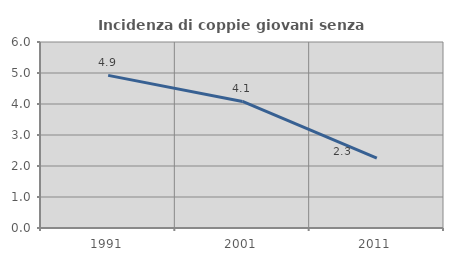
| Category | Incidenza di coppie giovani senza figli |
|---|---|
| 1991.0 | 4.924 |
| 2001.0 | 4.082 |
| 2011.0 | 2.257 |